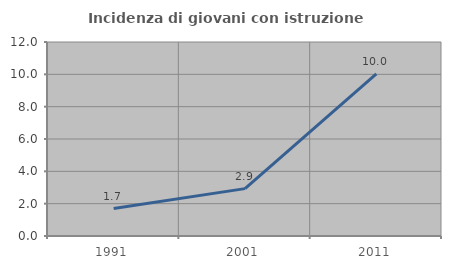
| Category | Incidenza di giovani con istruzione universitaria |
|---|---|
| 1991.0 | 1.697 |
| 2001.0 | 2.93 |
| 2011.0 | 10.023 |